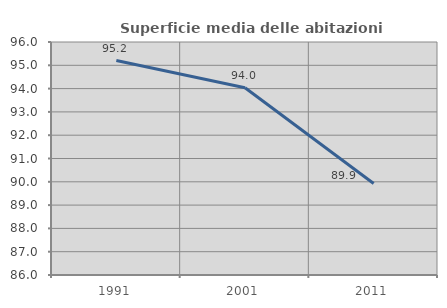
| Category | Superficie media delle abitazioni occupate |
|---|---|
| 1991.0 | 95.202 |
| 2001.0 | 94.034 |
| 2011.0 | 89.928 |